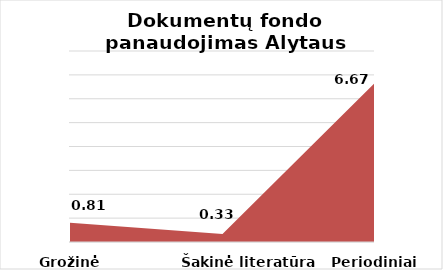
| Category | Series 0 |
|---|---|
| Grožinė literatūra | 0.805 |
| Šakinė literatūra | 0.33 |
| Periodiniai leidiniai | 6.668 |